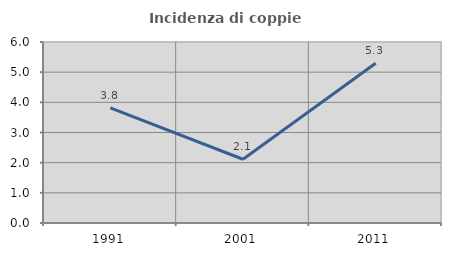
| Category | Incidenza di coppie miste |
|---|---|
| 1991.0 | 3.817 |
| 2001.0 | 2.113 |
| 2011.0 | 5.294 |